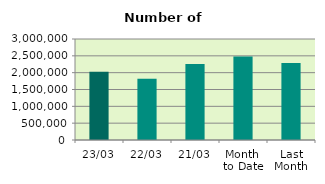
| Category | Series 0 |
|---|---|
| 23/03 | 2023906 |
| 22/03 | 1818050 |
| 21/03 | 2255704 |
| Month 
to Date | 2483229.059 |
| Last
Month | 2290810.7 |